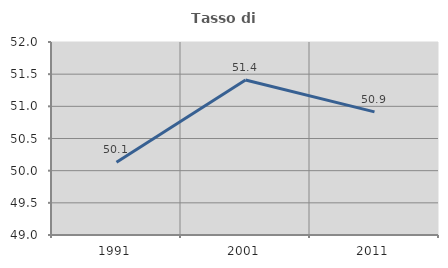
| Category | Tasso di occupazione   |
|---|---|
| 1991.0 | 50.131 |
| 2001.0 | 51.411 |
| 2011.0 | 50.914 |